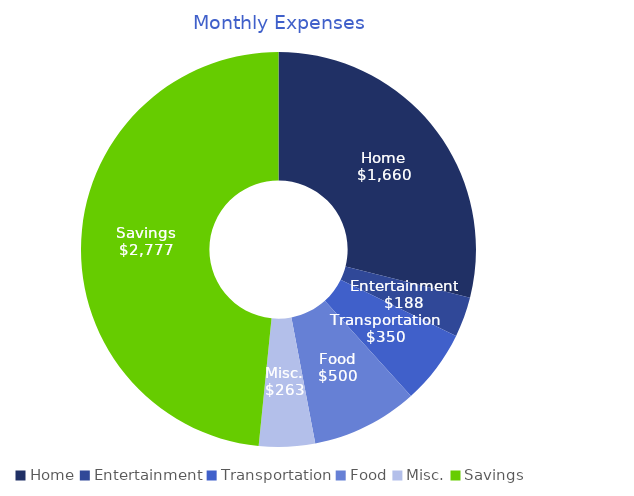
| Category | Series 0 |
|---|---|
| Home | 1660 |
| Entertainment | 188 |
| Transportation | 350 |
| Food | 500 |
| Misc. | 263 |
| Savings | 2777 |